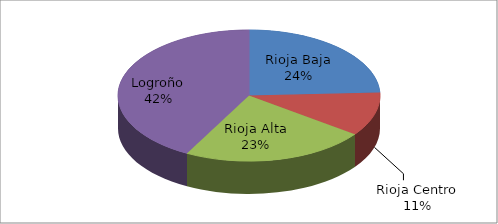
| Category | Series 0 |
|---|---|
| Rioja Baja | 1029 |
| Rioja Centro | 457 |
| Rioja Alta | 967 |
| Logroño | 1788 |